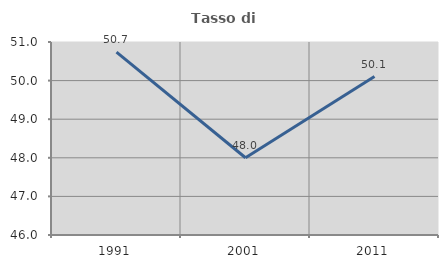
| Category | Tasso di occupazione   |
|---|---|
| 1991.0 | 50.738 |
| 2001.0 | 48.002 |
| 2011.0 | 50.106 |